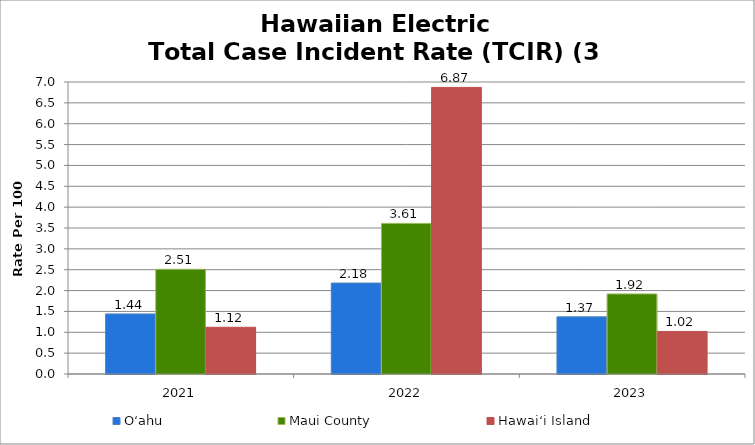
| Category | O‘ahu | Maui County | Hawai‘i Island |
|---|---|---|---|
| 2021.0 | 1.44 | 2.51 | 1.12 |
| 2022.0 | 2.18 | 3.61 | 6.87 |
| 2023.0 | 1.37 | 1.92 | 1.02 |